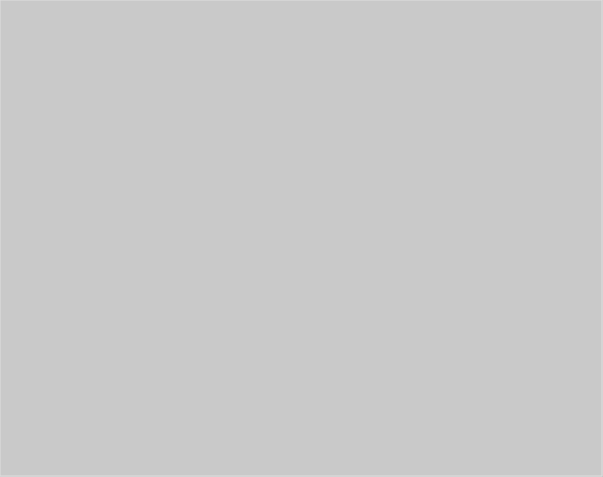
| Category | Series 0 |
|---|---|
| Rådighedsbeløb | 0 |
| Bolig | 0 |
| Husstandsudgifter | 0 |
| Transport | 0 |
| Forsikringer | 0 |
| Opsparing/afdrag | 0 |